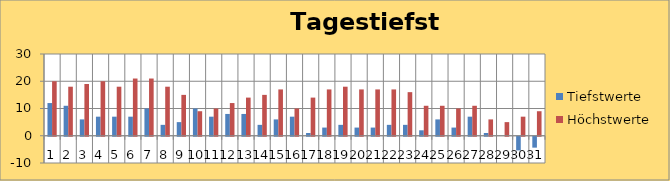
| Category | Tiefstwerte | Höchstwerte |
|---|---|---|
| 0 | 12 | 20 |
| 1 | 11 | 18 |
| 2 | 6 | 19 |
| 3 | 7 | 20 |
| 4 | 7 | 18 |
| 5 | 7 | 21 |
| 6 | 10 | 21 |
| 7 | 4 | 18 |
| 8 | 5 | 15 |
| 9 | 10 | 9 |
| 10 | 7 | 10 |
| 11 | 8 | 12 |
| 12 | 8 | 14 |
| 13 | 4 | 15 |
| 14 | 6 | 17 |
| 15 | 7 | 10 |
| 16 | 1 | 14 |
| 17 | 3 | 17 |
| 18 | 4 | 18 |
| 19 | 3 | 17 |
| 20 | 3 | 17 |
| 21 | 4 | 17 |
| 22 | 4 | 16 |
| 23 | 2 | 11 |
| 24 | 6 | 11 |
| 25 | 3 | 10 |
| 26 | 7 | 11 |
| 27 | 1 | 6 |
| 28 | 0 | 5 |
| 29 | -5 | 7 |
| 30 | -4 | 9 |